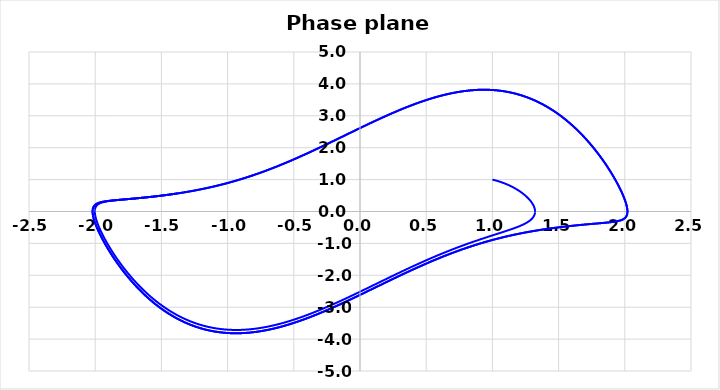
| Category | Limit cycle |
|---|---|
| 1.0 | 1 |
| 1.0197933949171882 | 0.979 |
| 1.03914770596447 | 0.956 |
| 1.0580254671649842 | 0.931 |
| 1.0763912294928906 | 0.905 |
| 1.0942118133788927 | 0.877 |
| 1.1114565302154946 | 0.847 |
| 1.1280973692363514 | 0.817 |
| 1.1441091470586815 | 0.784 |
| 1.1594696181584052 | 0.751 |
| 1.1741595455528482 | 0.717 |
| 1.188162731954155 | 0.683 |
| 1.2014660125894705 | 0.647 |
| 1.2140592117277966 | 0.612 |
| 1.2259350656811034 | 0.576 |
| 1.237089115639225 | 0.54 |
| 1.2475195741428324 | 0.503 |
| 1.2572271692927648 | 0.467 |
| 1.2662149709409305 | 0.431 |
| 1.2744882031178237 | 0.396 |
| 1.2820540468392958 | 0.361 |
| 1.2889214372189812 | 0.326 |
| 1.2951008585131094 | 0.292 |
| 1.3006041403624768 | 0.258 |
| 1.3054442580927605 | 0.226 |
| 1.3096351395083532 | 0.194 |
| 1.3131914801836095 | 0.162 |
| 1.316128568833362 | 0.132 |
| 1.3184621239435304 | 0.102 |
| 1.3202081424715622 | 0.073 |
| 1.3213827610915212 | 0.045 |
| 1.322002130163707 | 0.017 |
| 1.3220823003553783 | -0.009 |
| 1.3216391216273864 | -0.035 |
| 1.3206881541297772 | -0.06 |
| 1.319244590415135 | -0.084 |
| 1.3173231882783347 | -0.108 |
| 1.3149382134616945 | -0.131 |
| 1.3121033914213578 | -0.153 |
| 1.3088318673300967 | -0.174 |
| 1.3051361734898177 | -0.195 |
| 1.3010282033402603 | -0.216 |
| 1.2965191912754244 | -0.235 |
| 1.2916196975132255 | -0.255 |
| 1.2863395973041694 | -0.273 |
| 1.280688073809281 | -0.292 |
| 1.2746736140242465 | -0.31 |
| 1.2683040071742184 | -0.327 |
| 1.2615863450507687 | -0.344 |
| 1.2545270238080783 | -0.361 |
| 1.2471317467789065 | -0.378 |
| 1.239405527911639 | -0.395 |
| 1.231352695467413 | -0.411 |
| 1.2229768956507145 | -0.427 |
| 1.2142810958778205 | -0.443 |
| 1.2052675874149748 | -0.459 |
| 1.1959379871422773 | -0.474 |
| 1.1862932382199987 | -0.49 |
| 1.1763336094515449 | -0.506 |
| 1.166058693151709 | -0.522 |
| 1.155467401340336 | -0.538 |
| 1.1445579600902551 | -0.553 |
| 1.1333279018644729 | -0.57 |
| 1.1217740556813613 | -0.586 |
| 1.1098925349480797 | -0.602 |
| 1.097678722801935 | -0.619 |
| 1.0851272547969886 | -0.636 |
| 1.072231998769164 | -0.653 |
| 1.0589860317075803 | -0.671 |
| 1.0453816134531002 | -0.689 |
| 1.0314101570373488 | -0.708 |
| 1.0170621954670631 | -0.727 |
| 1.0023273447499095 | -0.747 |
| 0.9871942629492836 | -0.767 |
| 0.9716506050476192 | -0.788 |
| 0.955682973391012 | -0.809 |
| 0.9392768634833316 | -0.832 |
| 0.9224166048964424 | -0.855 |
| 0.9050852970659479 | -0.879 |
| 0.8872647397505754 | -0.904 |
| 0.8689353579498951 | -0.93 |
| 0.850076121101955 | -0.957 |
| 0.8306644564226574 | -0.985 |
| 0.8106761563060663 | -1.014 |
| 0.7900852797839921 | -1.045 |
| 0.7688640481499028 | -1.077 |
| 0.7469827349935411 | -1.111 |
| 0.7244095510772632 | -1.147 |
| 0.7011105247236266 | -1.184 |
| 0.6770493786889928 | -1.223 |
| 0.6521874048853725 | -1.264 |
| 0.6264833388009916 | -1.307 |
| 0.5998932360812081 | -1.352 |
| 0.5723703544914396 | -1.4 |
| 0.5438650454229336 | -1.451 |
| 0.5143246602551398 | -1.504 |
| 0.483693478293955 | -1.56 |
| 0.45191266470558544 | -1.619 |
| 0.41892026890561535 | -1.681 |
| 0.38465127628588347 | -1.746 |
| 0.34903772900672425 | -1.815 |
| 0.31200893487590914 | -1.888 |
| 0.2734917870830726 | -1.964 |
| 0.23341122172770623 | -2.044 |
| 0.19169084458126956 | -2.128 |
| 0.14825376318696587 | -2.216 |
| 0.10302366493284257 | -2.308 |
| 0.05592618568204451 | -2.403 |
| 0.006890616244180914 | -2.501 |
| -0.04414800550319837 | -2.603 |
| -0.09724637191999182 | -2.707 |
| -0.1524499152795164 | -2.813 |
| -0.20978932749063514 | -2.921 |
| -0.2692765912408031 | -3.028 |
| -0.3309005587048639 | -3.134 |
| -0.3946221615277199 | -3.237 |
| -0.4603693969000009 | -3.336 |
| -0.5280323081933325 | -3.429 |
| -0.5974582610765836 | -3.512 |
| -0.668447899903631 | -3.585 |
| -0.7407522427481584 | -3.643 |
| -0.8140714208534863 | -3.686 |
| -0.888055570682773 | -3.709 |
| -0.962308325517788 | -3.712 |
| -1.0363932147438133 | -3.692 |
| -1.10984305913079 | -3.649 |
| -1.1821721619331367 | -3.58 |
| -1.252890769456076 | -3.488 |
| -1.3215209586261691 | -3.372 |
| -1.387612859934962 | -3.234 |
| -1.4507599952718406 | -3.078 |
| -1.5106125370863044 | -2.905 |
| -1.5668874841337506 | -2.72 |
| -1.619375072550673 | -2.527 |
| -1.6679411442113492 | -2.329 |
| -1.7125256081486913 | -2.13 |
| -1.7531374891450704 | -1.932 |
| -1.7898473120959935 | -1.74 |
| -1.8227776991836733 | -1.555 |
| -1.852093063343099 | -1.379 |
| -1.8779891900481298 | -1.213 |
| -1.9006833446421512 | -1.058 |
| -1.9204053599243567 | -0.916 |
| -1.937389978344706 | -0.785 |
| -1.9518705655873914 | -0.665 |
| -1.964074188489359 | -0.557 |
| -1.9742179630011463 | -0.459 |
| -1.9825065244740998 | -0.371 |
| -1.9891304470386872 | -0.293 |
| -1.994265434201098 | -0.222 |
| -1.9980721122718956 | -0.16 |
| -2.0006962761185707 | -0.104 |
| -2.002269458585917 | -0.054 |
| -2.0029097176345876 | -0.01 |
| -2.002722556805349 | 0.028 |
| -2.001801913892307 | 0.063 |
| -2.000231169198946 | 0.094 |
| -1.9980841383707622 | 0.121 |
| -1.9954260257165173 | 0.145 |
| -1.9923143224500839 | 0.166 |
| -1.988799640763743 | 0.185 |
| -1.9849264794412287 | 0.202 |
| -1.9807339201678424 | 0.217 |
| -1.9762562560876076 | 0.23 |
| -1.9715235557401425 | 0.243 |
| -1.9665621664845614 | 0.253 |
| -1.9613951620457182 | 0.263 |
| -1.9560427390260262 | 0.272 |
| -1.9505225672112194 | 0.28 |
| -1.9448500983344017 | 0.287 |
| -1.9390388377042216 | 0.294 |
| -1.933100582789941 | 0.3 |
| -1.9270456325170353 | 0.306 |
| -1.9208829706816606 | 0.311 |
| -1.914620426554242 | 0.316 |
| -1.9082648154202373 | 0.32 |
| -1.9018220615049741 | 0.324 |
| -1.8952973054520654 | 0.328 |
| -1.888694998272275 | 0.332 |
| -1.882018983451633 | 0.336 |
| -1.875272568703177 | 0.339 |
| -1.8684585886644876 | 0.342 |
| -1.861579459681544 | 0.346 |
| -1.8546372276765668 | 0.349 |
| -1.8476336099716348 | 0.352 |
| -1.8405700318292457 | 0.355 |
| -1.8334476583739627 | 0.358 |
| -1.8262674224743405 | 0.36 |
| -1.819030049090045 | 0.363 |
| -1.8117360765242 | 0.366 |
| -1.8043858749643706 | 0.369 |
| -1.7969796626462062 | 0.372 |
| -1.7895175199307105 | 0.375 |
| -1.7819994015485778 | 0.377 |
| -1.7744251472323305 | 0.38 |
| -1.7667944909284898 | 0.383 |
| -1.7591070687571722 | 0.386 |
| -1.751362425864839 | 0.389 |
| -1.7435600222970373 | 0.392 |
| -1.7356992380014828 | 0.395 |
| -1.7277793770574366 | 0.397 |
| -1.7197996712147432 | 0.4 |
| -1.711759282814893 | 0.404 |
| -1.7036573071568242 | 0.407 |
| -1.6954927743617274 | 0.41 |
| -1.6872646507836884 | 0.413 |
| -1.67897184000646 | 0.416 |
| -1.6706131834608968 | 0.42 |
| -1.6621874606924778 | 0.423 |
| -1.653693389303825 | 0.426 |
| -1.6451296245930966 | 0.43 |
| -1.6364947589055345 | 0.434 |
| -1.627787320712218 | 0.437 |
| -1.6190057734271535 | 0.441 |
| -1.6101485139711837 | 0.445 |
| -1.601213871088773 | 0.449 |
| -1.5922001034214919 | 0.453 |
| -1.5831053973399427 | 0.457 |
| -1.5739278645339216 | 0.461 |
| -1.5646655393587565 | 0.465 |
| -1.555316375933993 | 0.47 |
| -1.5458782449888804 | 0.474 |
| -1.5363489304474323 | 0.479 |
| -1.5267261257441684 | 0.484 |
| -1.5170074298599856 | 0.488 |
| -1.507190343065918 | 0.493 |
| -1.4972722623608399 | 0.498 |
| -1.4872504765873955 | 0.504 |
| -1.4771221612086147 | 0.509 |
| -1.4668843727257668 | 0.515 |
| -1.4565340427160025 | 0.52 |
| -1.4460679714662172 | 0.526 |
| -1.435482821177331 | 0.532 |
| -1.4247751087107914 | 0.539 |
| -1.4139411978465612 | 0.545 |
| -1.4029772910191178 | 0.552 |
| -1.3918794204950697 | 0.558 |
| -1.3806434389528408 | 0.565 |
| -1.369265009421486 | 0.573 |
| -1.3577395945320418 | 0.58 |
| -1.3460624450308767 | 0.588 |
| -1.3342285875002389 | 0.596 |
| -1.3222328112266115 | 0.604 |
| -1.3100696541525056 | 0.612 |
| -1.2977333878419652 | 0.621 |
| -1.285218001384264 | 0.63 |
| -1.2725171841540222 | 0.64 |
| -1.2596243073392404 | 0.65 |
| -1.2465324041414882 | 0.66 |
| -1.233234148544689 | 0.67 |
| -1.2197218325405657 | 0.681 |
| -1.2059873416898481 | 0.692 |
| -1.19202212888876 | 0.704 |
| -1.1778171862001021 | 0.716 |
| -1.16336301459743 | 0.729 |
| -1.1486495914594048 | 0.742 |
| -1.133666335639403 | 0.756 |
| -1.1184020699229922 | 0.77 |
| -1.1028449806729799 | 0.785 |
| -1.0869825744485924 | 0.801 |
| -1.0708016313721187 | 0.817 |
| -1.0542881550033378 | 0.834 |
| -1.0374273184695983 | 0.852 |
| -1.0202034065880121 | 0.871 |
| -1.0025997537064846 | 0.89 |
| -0.9845986769830373 | 0.91 |
| -0.9661814048191243 | 0.932 |
| -0.9473280001637301 | 0.954 |
| -0.9280172784126406 | 0.977 |
| -0.9082267196435398 | 1.002 |
| -0.8879323749551791 | 1.028 |
| -0.8671087667211647 | 1.055 |
| -0.845728782630121 | 1.083 |
| -0.8237635634693461 | 1.113 |
| -0.8011823847250945 | 1.145 |
| -0.777952532227331 | 1.178 |
| -0.7540391722700931 | 1.213 |
| -0.7294052169026094 | 1.25 |
| -0.7040111854258131 | 1.289 |
| -0.6778150635617975 | 1.331 |
| -0.6507721623116299 | 1.374 |
| -0.6228349792055201 | 1.42 |
| -0.5939530655090575 | 1.469 |
| -0.5640729040155834 | 1.52 |
| -0.533137803368559 | 1.574 |
| -0.5010878164649085 | 1.631 |
| -0.4678596924409708 | 1.692 |
| -0.43338687408957355 | 1.756 |
| -0.39759955535181485 | 1.823 |
| -0.3604248168161501 | 1.895 |
| -0.32178686097141856 | 1.97 |
| -0.28160737330321295 | 2.049 |
| -0.23980604015255225 | 2.132 |
| -0.19630125945920418 | 2.219 |
| -0.15101108587116138 | 2.311 |
| -0.10385445684978276 | 2.406 |
| -0.05475275076746734 | 2.505 |
| -0.003631730747976611 | 2.608 |
| 0.04957607202205966 | 2.714 |
| 0.10492848611956938 | 2.822 |
| 0.1624703000566578 | 2.932 |
| 0.2222293151710773 | 3.044 |
| 0.28421186186790204 | 3.155 |
| 0.34839783362644605 | 3.264 |
| 0.4147353522983309 | 3.369 |
| 0.48313525305680494 | 3.47 |
| 0.5534656658468616 | 3.562 |
| 0.6255470666128538 | 3.644 |
| 0.6991482654926284 | 3.714 |
| 0.7739838748349923 | 3.767 |
| 0.8497138369062666 | 3.803 |
| 0.9259455667497861 | 3.817 |
| 1.0022391592381419 | 3.808 |
| 1.0781159088118955 | 3.775 |
| 1.1530700992007241 | 3.716 |
| 1.2265836631183333 | 3.631 |
| 1.2981429352613973 | 3.521 |
| 1.3672563893287633 | 3.387 |
| 1.4334720286366207 | 3.231 |
| 1.4963930445106206 | 3.058 |
| 1.5556904916189587 | 2.87 |
| 1.611112040122334 | 2.671 |
| 1.6624862985529307 | 2.466 |
| 1.709722681428863 | 2.258 |
| 1.7528072395835816 | 2.051 |
| 1.7917952119875322 | 1.849 |
| 1.8268012571708958 | 1.653 |
| 1.8579883745684895 | 1.467 |
| 1.88555645292661 | 1.292 |
| 1.9097312226150343 | 1.128 |
| 1.930754184173776 | 0.976 |
| 1.9488738746840626 | 0.838 |
| 1.964338644216772 | 0.711 |
| 1.9773909625014858 | 0.596 |
| 1.9882631665144184 | 0.493 |
| 1.9971744908291649 | 0.4 |
| 2.0043291878414315 | 0.317 |
| 2.0099155361339425 | 0.243 |
| 2.0141055441309086 | 0.177 |
| 2.017055175771425 | 0.119 |
| 2.018904949738615 | 0.067 |
| 2.0197807899302376 | 0.021 |
| 2.0197950298388267 | -0.019 |
| 2.019047495899386 | -0.055 |
| 2.0176266140160255 | -0.087 |
| 2.0156104992718546 | -0.115 |
| 2.0130680014506366 | -0.139 |
| 2.0100596888124453 | -0.161 |
| 2.0066387599932 | -0.181 |
| 2.002851879366871 | -0.198 |
| 1.998739935114129 | -0.213 |
| 1.99433872192715 | -0.227 |
| 1.9896795520369237 | -0.239 |
| 1.9847897993128756 | -0.25 |
| 1.9796933817427211 | -0.26 |
| 1.974411187799498 | -0.268 |
| 1.9689614521544943 | -0.276 |
| 1.9633600859832514 | -0.284 |
| 1.957620966798903 | -0.29 |
| 1.9517561923775673 | -0.296 |
| 1.945776302946057 | -0.302 |
| 1.939690475404605 | -0.307 |
| 1.9335066929711198 | -0.312 |
| 1.9272318932678405 | -0.316 |
| 1.9208720975314126 | -0.32 |
| 1.9144325233159578 | -0.324 |
| 1.9079176827763433 | -0.328 |
| 1.9013314683650335 | -0.331 |
| 1.8946772275492882 | -0.334 |
| 1.8879578279542488 | -0.338 |
| 1.881175714159571 | -0.341 |
| 1.8743329572205827 | -0.344 |
| 1.8674312978473495 | -0.347 |
| 1.8604721840544898 | -0.349 |
| 1.8534568039891754 | -0.352 |
| 1.8463861145527516 | -0.355 |
| 1.8392608663511834 | -0.358 |
| 1.8320816254396717 | -0.36 |
| 1.8248487922659722 | -0.363 |
| 1.8175626181640547 | -0.366 |
| 1.8102232197037582 | -0.368 |
| 1.8028305911621179 | -0.371 |
| 1.7953846153472919 | -0.374 |
| 1.7878850729758191 | -0.376 |
| 1.780331650777678 | -0.379 |
| 1.7727239484807877 | -0.382 |
| 1.765061484806731 | -0.385 |
| 1.7573437025921919 | -0.387 |
| 1.7495699731355487 | -0.39 |
| 1.7417395998549396 | -0.393 |
| 1.7338518213326783 | -0.396 |
| 1.725905813810902 | -0.399 |
| 1.7179006931945984 | -0.402 |
| 1.709835516610511 | -0.405 |
| 1.7017092835637162 | -0.408 |
| 1.6935209367277706 | -0.411 |
| 1.6852693623991442 | -0.414 |
| 1.676953390642071 | -0.417 |
| 1.6685717951458945 | -0.421 |
| 1.6601232928133811 | -0.424 |
| 1.6516065430952627 | -0.428 |
| 1.6430201470833823 | -0.431 |
| 1.6343626463722236 | -0.435 |
| 1.6256325216962464 | -0.438 |
| 1.6168281913482996 | -0.442 |
| 1.6079480093824048 | -0.446 |
| 1.5989902636023627 | -0.45 |
| 1.5899531733359134 | -0.454 |
| 1.5808348869925506 | -0.458 |
| 1.5716334794015325 | -0.462 |
| 1.5623469489251176 | -0.466 |
| 1.5529732143405879 | -0.471 |
| 1.5435101114831555 | -0.475 |
| 1.5339553896403995 | -0.48 |
| 1.524306707687406 | -0.485 |
| 1.5145616299502913 | -0.49 |
| 1.504717621784248 | -0.495 |
| 1.4947720448506612 | -0.5 |
| 1.4847221520761857 | -0.505 |
| 1.4745650822749263 | -0.511 |
| 1.464297854413031 | -0.516 |
| 1.4539173614930563 | -0.522 |
| 1.4434203640333911 | -0.528 |
| 1.4328034831158156 | -0.534 |
| 1.4220631929718988 | -0.54 |
| 1.4111958130764017 | -0.547 |
| 1.4001974997131164 | -0.553 |
| 1.3890642369756296 | -0.56 |
| 1.3777918271623284 | -0.567 |
| 1.3663758805215376 | -0.574 |
| 1.3548118042989825 | -0.582 |
| 1.3430947910357751 | -0.59 |
| 1.3312198060607965 | -0.598 |
| 1.3191815741166844 | -0.606 |
| 1.3069745650535836 | -0.615 |
| 1.2945929785193637 | -0.624 |
| 1.2820307275691167 | -0.633 |
| 1.2692814211103933 | -0.642 |
| 1.2563383450937786 | -0.652 |
| 1.2431944423510328 | -0.662 |
| 1.229842290975086 | -0.673 |
| 1.2162740811276598 | -0.684 |
| 1.2024815901511816 | -0.695 |
| 1.1884561558519187 | -0.707 |
| 1.1741886478109105 | -0.72 |
| 1.1596694365683091 | -0.732 |
| 1.144888360515171 | -0.746 |
| 1.1298346903146275 | -0.76 |
| 1.1144970906617657 | -0.774 |
| 1.0988635791785795 | -0.789 |
| 1.0829214822271587 | -0.805 |
| 1.0666573874110956 | -0.821 |
| 1.0500570925221697 | -0.839 |
| 1.0331055506771474 | -0.857 |
| 1.0157868113784785 | -0.875 |
| 0.9980839572234768 | -0.895 |
| 0.9799790359800907 | -0.916 |
| 0.9614529877447026 | -0.937 |
| 0.9424855668999582 | -0.96 |
| 0.9230552586002075 | -0.983 |
| 0.9031391895309895 | -1.008 |
| 0.8827130327199685 | -1.034 |
| 0.8617509062233849 | -1.062 |
| 0.8402252655788708 | -1.091 |
| 0.8181067900079413 | -1.121 |
| 0.7953642624764659 | -1.153 |
| 0.7719644438874262 | -1.187 |
| 0.747871941897704 | -1.223 |
| 0.7230490751322636 | -1.26 |
| 0.6974557339304316 | -1.3 |
| 0.6710492392188164 | -1.341 |
| 0.6437842016863291 | -1.386 |
| 0.6156123841656406 | -1.432 |
| 0.5864825710339283 | -1.481 |
| 0.5563404495707568 | -1.533 |
| 0.5251285095945366 | -1.588 |
| 0.49278596938830194 | -1.646 |
| 0.45924873797159077 | -1.708 |
| 0.42444942623090626 | -1.773 |
| 0.38831742233757516 | -1.841 |
| 0.3507790503017961 | -1.913 |
| 0.311757834460823 | -1.989 |
| 0.2711748971716822 | -2.07 |
| 0.2289495219173599 | -2.154 |
| 0.18499991930401535 | -2.242 |
| 0.13924423877424846 | -2.334 |
| 0.09160187387495433 | -2.431 |
| 0.04199511296746764 | -2.531 |
| -0.00964881055800778 | -2.634 |
| -0.06339521545517078 | -2.741 |
| -0.11929896979745075 | -2.85 |
| -0.17740095331166492 | -2.961 |
| -0.23772397175967386 | -3.072 |
| -0.3002681437275775 | -3.182 |
| -0.3650058277181154 | -3.291 |
| -0.4318762205790669 | -3.395 |
| -0.5007798369149808 | -3.494 |
| -0.5715731703435887 | -3.584 |
| -0.644063934444393 | -3.663 |
| -0.7180073722327737 | -3.729 |
| -0.793104190945973 | -3.778 |
| -0.869000702537314 | -3.808 |
| -0.9452917068228256 | -3.817 |
| -1.0215265245960412 | -3.802 |
| -1.0972183634153208 | -3.763 |
| -1.1718568875871145 | -3.697 |
| -1.2449234964177973 | -3.605 |
| -1.3159084428763834 | -3.489 |
| -1.3843286142676194 | -3.349 |
| -1.4497446131581326 | -3.189 |
| -1.5117757687809106 | -3.011 |
| -1.5701118916624148 | -2.82 |
| -1.6245209324269647 | -2.619 |
| -1.6748521593247234 | -2.413 |
| -1.7210349474705944 | -2.205 |
| -1.763073695986142 | -1.999 |
| -1.8010396965083773 | -1.798 |
| -1.8350609378821012 | -1.605 |
| -1.865310849365955 | -1.422 |
| -1.8919968854204627 | -1.249 |
| -1.9153496796406415 | -1.088 |
| -1.93561328605538 | -0.94 |
| -1.9530368185516445 | -0.804 |
| -1.9678676182310595 | -0.681 |
| -1.9803459370444332 | -0.569 |
| -1.9907010273124468 | -0.468 |
| -1.999148467254813 | -0.378 |
| -2.005888525279494 | -0.297 |
| -2.011105362171793 | -0.226 |
| -2.0149668825247287 | -0.162 |
| -2.0176250681102865 | -0.105 |
| -2.01921665134762 | -0.055 |
| -2.0198640130671 | -0.011 |
| -2.0196762131938635 | 0.029 |
| -2.018750084580788 | 0.063 |
| -2.0171713385189127 | 0.094 |
| -2.0150156454164767 | 0.121 |
| -2.0123496660118665 | 0.145 |
| -2.009232017653745 | 0.166 |
| -2.005714167073316 | 0.185 |
| -2.0018412461107 | 0.202 |
| -1.9976527904229637 | 0.217 |
| -1.9931834036265346 | 0.23 |
| -1.9884633508873693 | 0.242 |
| -1.983519086891613 | 0.252 |
| -1.9783737235842258 | 0.262 |
| -1.9730474431900293 | 0.271 |
| -1.967557861935025 | 0.278 |
| -1.9619203496434863 | 0.285 |
| -1.9561483100553938 | 0.292 |
| -1.9502534263303561 | 0.298 |
| -1.9442458758071774 | 0.303 |
| -1.9381345176924119 | 0.308 |
| -1.931927056969572 | 0.313 |
| -1.9256301874611705 | 0.317 |
| -1.919249716642965 | 0.321 |
| -1.9127906745056809 | 0.325 |
| -1.9062574084844481 | 0.328 |
| -1.8996536662294006 | 0.332 |
| -1.8929826677708894 | 0.335 |
| -1.8862471684376538 | 0.338 |
| -1.8794495137139808 | 0.341 |
| -1.8725916870702441 | 0.344 |
| -1.8656753516681224 | 0.347 |
| -1.858701886725265 | 0.35 |
| -1.851672419222329 | 0.353 |
| -1.8445878515464322 | 0.356 |
| -1.837448885587599 | 0.358 |
| -1.8302560437373236 | 0.361 |
| -1.82300968717967 | 0.364 |
| -1.815710031814278 | 0.366 |
| -1.808357162106265 | 0.369 |
| -1.800951043119422 | 0.372 |
| -1.7934915309555792 | 0.374 |
| -1.7859783817938633 | 0.377 |
| -1.7784112596982256 | 0.38 |
| -1.7707897433395845 | 0.382 |
| -1.7631133317597527 | 0.385 |
| -1.755381449287626 | 0.388 |
| -1.7475934497035777 | 0.391 |
| -1.7397486197353276 | 0.394 |
| -1.7318461819575013 | 0.397 |
| -1.723885297157433 | 0.4 |
| -1.715865066221328 | 0.403 |
| -1.7077845315874969 | 0.406 |
| -1.6996426783068916 | 0.409 |
| -1.6914384347454638 | 0.412 |
| -1.6831706729578457 | 0.415 |
| -1.6748382087574105 | 0.418 |
| -1.666439801503838 | 0.422 |
| -1.6579741536258086 | 0.425 |
| -1.6494399098933252 | 0.428 |
| -1.640835656451356 | 0.432 |
| -1.6321599196239593 | 0.436 |
| -1.6234111644957496 | 0.439 |
| -1.6145877932754602 | 0.443 |
| -1.6056881434444168 | 0.447 |
| -1.5967104856909273 | 0.451 |
| -1.5876530216299003 | 0.455 |
| -1.578513881305389 | 0.459 |
| -1.5692911204722164 | 0.463 |
| -1.5599827176513388 | 0.468 |
| -1.5505865709521323 | 0.472 |
| -1.5411004946533382 | 0.477 |
| -1.5315222155329375 | 0.481 |
| -1.521849368935755 | 0.486 |
| -1.5120794945660876 | 0.491 |
| -1.5022100319910963 | 0.496 |
| -1.4922383158391022 | 0.501 |
| -1.4821615706752356 | 0.507 |
| -1.4719769055351335 | 0.512 |
| -1.4616813080955062 | 0.518 |
| -1.4512716384584248 | 0.523 |
| -1.4407446225240659 | 0.529 |
| -1.4300968449244098 | 0.535 |
| -1.4193247414879657 | 0.542 |
| -1.408424591203021 | 0.548 |
| -1.397392507644119 | 0.555 |
| -1.3862244298234725 | 0.562 |
| -1.3749161124257916 | 0.569 |
| -1.3634631153815022 | 0.576 |
| -1.3518607927295705 | 0.584 |
| -1.340104280717064 | 0.592 |
| -1.3281884850781818 | 0.6 |
| -1.3161080674307144 | 0.608 |
| -1.3038574307227553 | 0.617 |
| -1.2914307036569168 | 0.626 |
| -1.278821724013302 | 0.635 |
| -1.2660240207860014 | 0.645 |
| -1.2530307950409032 | 0.655 |
| -1.2398348993950818 | 0.665 |
| -1.2264288160099586 | 0.676 |
| -1.2128046329817581 | 0.687 |
| -1.1989540190035202 | 0.698 |
| -1.1848681961630323 | 0.71 |
| -1.1705379107305456 | 0.723 |
| -1.1559534017790087 | 0.736 |
| -1.141104367467848 | 0.749 |
| -1.125979928809074 | 0.763 |
| -1.110568590721793 | 0.778 |
| -1.09485820016816 | 0.793 |
| -1.0788359011505886 | 0.809 |
| -1.0624880863368917 | 0.826 |
| -1.0458003450672357 | 0.843 |
| -1.0287574074848114 | 0.861 |
| -1.0113430845214717 | 0.88 |
| -0.9935402034609876 | 0.9 |
| -0.9753305387969411 | 0.921 |
| -0.9566947381007869 | 0.943 |
| -0.9376122426197634 | 0.966 |
| -0.91806120233603 | 0.99 |
| -0.898018385240028 | 1.015 |
| -0.877459080605643 | 1.041 |
| -0.8563569961060324 | 1.069 |
| -0.8346841486817 | 1.098 |
| -0.8124107491723851 | 1.129 |
| -0.7895050808588349 | 1.162 |
| -0.7659333722384811 | 1.196 |
| -0.7416596645914156 | 1.232 |
| -0.7166456751932695 | 1.27 |
| -0.6908506574159562 | 1.31 |
| -0.6642312594454283 | 1.352 |
| -0.6367413839612415 | 1.397 |
| -0.6083320518938727 | 1.444 |
| -0.5789512743353524 | 1.494 |
| -0.5485439378650334 | 1.547 |
| -0.5170517100086607 | 1.603 |
| -0.48441297332355066 | 1.662 |
| -0.45056279874741517 | 1.724 |
| -0.4154329714160181 | 1.79 |
| -0.3789520851950988 | 1.859 |
| -0.3410457257244559 | 1.932 |
| -0.3016367658558737 | 2.009 |
| -0.260645801964979 | 2.09 |
| -0.2179917646558996 | 2.176 |
| -0.17359274269542155 | 2.265 |
| -0.12736706432286432 | 2.358 |
| -0.07923468492084944 | 2.456 |
| -0.02911893370532409 | 2.557 |
| 0.023051326390971467 | 2.661 |
| 0.07733907345706804 | 2.768 |
| 0.13379599102067458 | 2.878 |
| 0.19245879183075165 | 2.989 |
| 0.25334499515881664 | 3.1 |
| 0.31644818860059437 | 3.21 |
| 0.3817328567480137 | 3.318 |
| 0.44912892625616546 | 3.421 |
| 0.5185262590409375 | 3.518 |
| 0.5897694188447214 | 3.605 |
| 0.6626531331977649 | 3.681 |
| 0.7369189597674144 | 3.743 |
| 0.8122537249529633 | 3.788 |
| 0.8882903113277163 | 3.813 |
| 0.9646113067898924 | 3.816 |
| 1.040755874879009 | 3.795 |
| 1.1162299575830366 | 3.748 |
| 1.1905195927687853 | 3.676 |
| 1.2631067541463323 | 3.578 |
| 1.3334867587750932 | 3.456 |
| 1.401186002937013 | 3.311 |
| 1.4657786447556433 | 3.146 |
| 1.5269008922558565 | 2.964 |
| 1.5842617839377375 | 2.77 |
| 1.6376497306495896 | 2.568 |
| 1.6869345553893877 | 2.36 |
| 1.7320652392123015 | 2.153 |
| 1.7730639799270327 | 1.948 |
| 1.810017442117304 | 1.749 |
| 1.843066200614834 | 1.558 |
| 1.8723933642035135 | 1.377 |
| 1.898213243685148 | 1.207 |
| 1.920760740507145 | 1.05 |
| 1.9402819203062969 | 0.905 |
| 1.9570260331157394 | 0.772 |
| 1.97123907023107 | 0.651 |
| 1.9831588170980556 | 0.542 |
| 1.993011273304029 | 0.445 |
| 2.001008260156446 | 0.357 |
| 2.007346015770318 | 0.278 |
| 2.0122045786870633 | 0.209 |
| 2.0157477761344227 | 0.147 |
| 2.0181236558467828 | 0.092 |
| 2.0194652262454724 | 0.043 |
| 2.019891395575279 | 0 |
| 2.019508024385421 | -0.038 |
| 2.0184090265363333 | -0.071 |
| 2.0166774713565605 | -0.101 |
| 2.014386653724734 | -0.127 |
| 2.011601110001506 | -0.151 |
| 2.0083775662871135 | -0.171 |
| 2.0047658118637925 | -0.19 |
| 2.0008094953125513 | -0.206 |
| 1.9965468440416345 | -0.22 |
| 1.9920113101464556 | -0.233 |
| 1.9872321468999474 | -0.245 |
| 1.9822349209590575 | -0.255 |
| 1.9770419657333524 | -0.264 |
| 1.9716727814233923 | -0.273 |
| 1.9661443870965838 | -0.28 |
| 1.9604716298987623 | -0.287 |
| 1.9546674561534507 | -0.293 |
| 1.9487431487152977 | -0.299 |
| 1.9427085345459476 | -0.304 |
| 1.9365721660873492 | -0.309 |
| 1.9303414796308573 | -0.314 |
| 1.9240229335274317 | -0.318 |
| 1.9176221287585802 | -0.322 |
| 1.9111439140909816 | -0.326 |
| 1.904592477769932 | -0.329 |
| 1.8979714274669224 | -0.333 |
| 1.8912838599831436 | -0.336 |
| 1.884532422021574 | -0.339 |
| 1.8777193631734357 | -0.342 |
| 1.8708465821180462 | -0.345 |
| 1.8639156669063859 | -0.348 |
| 1.8569279300860515 | -0.351 |
| 1.849884439326863 | -0.354 |
| 1.8427860441205395 | -0.356 |
| 1.8356333990530562 | -0.359 |
| 1.8284269840831637 | -0.362 |
| 1.8211671222038883 | -0.364 |
| 1.813853994814554 | -0.367 |
| 1.8064876550880313 | -0.37 |
| 1.7990680395806797 | -0.372 |
| 1.7915949783000853 | -0.375 |
| 1.784068203417566 | -0.378 |
| 1.7764873567879509 | -0.38 |
| 1.7688519964178713 | -0.383 |
| 1.7611616020052825 | -0.386 |
| 1.7534155796568318 | -0.389 |
| 1.7456132658756347 | -0.392 |
| 1.737753930899792 | -0.394 |
| 1.7298367814612905 | -0.397 |
| 1.7218609630256003 | -0.4 |
| 1.7138255615641147 | -0.403 |
| 1.705729604904425 | -0.406 |
| 1.6975720636971452 | -0.409 |
| 1.689351852032476 | -0.413 |
| 1.681067827734832 | -0.416 |
| 1.67271879235955 | -0.419 |
| 1.6643034909118748 | -0.422 |
| 1.6558206113050302 | -0.426 |
| 1.6472687835711266 | -0.429 |
| 1.638646578835941 | -0.433 |
| 1.629952508066122 | -0.437 |
| 1.6211850205951333 | -0.44 |
| 1.6123425024321831 | -0.444 |
| 1.603423274356485 | -0.448 |
| 1.5944255897974173 | -0.452 |
| 1.5853476324994784 | -0.456 |
| 1.576187513969337 | -0.46 |
| 1.5669432707007531 | -0.464 |
| 1.5576128611716487 | -0.469 |
| 1.5481941626061488 | -0.473 |
| 1.5386849674929555 | -0.478 |
| 1.5290829798499572 | -0.482 |
| 1.5193858112234966 | -0.487 |
| 1.5095909764091997 | -0.492 |
| 1.499695888879712 | -0.497 |
| 1.4896978559030551 | -0.503 |
| 1.4795940733336235 | -0.508 |
| 1.4693816200560474 | -0.513 |
| 1.4590574520602595 | -0.519 |
| 1.4486183961240906 | -0.525 |
| 1.438061143077582 | -0.531 |
| 1.4273822406209091 | -0.537 |
| 1.4165780856653596 | -0.543 |
| 1.4056449161641715 | -0.55 |
| 1.394578802397201 | -0.557 |
| 1.3833756376703321 | -0.564 |
| 1.3720311283872448 | -0.571 |
| 1.3605407834475953 | -0.578 |
| 1.3488999029218174 | -0.586 |
| 1.3371035659485964 | -0.594 |
| 1.325146617796574 | -0.602 |
| 1.3130236560269828 | -0.61 |
| 1.3007290156886606 | -0.619 |
| 1.288256753471225 | -0.628 |
| 1.2756006307360626 | -0.638 |
| 1.2627540953381835 | -0.647 |
| 1.2497102621448792 | -0.657 |
| 1.2364618921494581 | -0.668 |
| 1.2230013700701134 | -0.678 |
| 1.2093206803151642 | -0.69 |
| 1.195411381186477 | -0.701 |
| 1.1812645771828418 | -0.713 |
| 1.1668708892543982 | -0.726 |
| 1.152220422847942 | -0.739 |
| 1.137302733571087 | -0.753 |
| 1.1221067902908868 | -0.767 |
| 1.1066209354697205 | -0.782 |
| 1.0908328425281402 | -0.797 |
| 1.0747294700111538 | -0.813 |
| 1.05829701232133 | -0.83 |
| 1.04152084676948 | -0.848 |
| 1.0243854766819742 | -0.866 |
| 1.006874470293538 | -0.885 |
| 0.9889703951464347 | -0.905 |
| 0.97065474771223 | -0.926 |
| 0.9519078779521196 | -0.948 |
| 0.9327089085376652 | -0.972 |
| 0.9130356484677397 | -0.996 |
| 0.8928645008420742 | -1.021 |
| 0.8721703645902171 | -1.048 |
| 0.850926530010939 | -1.076 |
| 0.8291045680561366 | -1.106 |
| 0.8066742134012619 | -1.137 |
| 0.7836032414888837 | -1.17 |
| 0.759857339922591 | -1.205 |
| 0.7353999748366147 | -1.241 |
| 0.7101922531863887 | -1.28 |
| 0.6841927823138978 | -1.32 |
| 0.6573575286597129 | -1.363 |
| 0.6296396781457793 | -1.409 |
| 0.6009895015685605 | -1.457 |
| 0.5713542293552999 | -1.507 |
| 0.5406779412864788 | -1.561 |
| 0.5089014783197263 | -1.617 |
| 0.47596238551376124 | -1.677 |
| 0.4417948972977604 | -1.74 |
| 0.40632997901437445 | -1.807 |
| 0.36949544183135735 | -1.877 |
| 0.3312161518030156 | -1.951 |
| 0.29141435808014937 | -2.029 |
| 0.2500101699869012 | -2.112 |
| 0.2069222178118178 | -2.198 |
| 0.16206853750930061 | -2.288 |
| 0.11536772474986613 | -2.383 |
| 0.06674040837783522 | -2.481 |
| 0.01611109656905598 | -2.583 |
| -0.03658955024751672 | -2.688 |
| -0.09142196877823835 | -2.796 |
| -0.1484344225317823 | -2.906 |
| -0.2076591866141132 | -3.017 |
| -0.2691081898608816 | -3.128 |
| -0.3327681568484436 | -3.238 |
| -0.3985953476473008 | -3.344 |
| -0.46651006431418873 | -3.446 |
| -0.536391178691569 | -3.541 |
| -0.6080710313647049 | -3.626 |
| -0.6813311473812552 | -3.698 |
| -0.7558992961044906 | -3.756 |
| -0.8314484709214022 | -3.796 |
| -0.9075983569441703 | -3.816 |
| -0.9839197696791508 | -3.813 |
| -1.0599423700969148 | -3.785 |
| -1.1351656907408905 | -3.733 |
| -1.209073162624909 | -3.654 |
| -1.2811484553341226 | -3.55 |
| -1.3508930932656116 | -3.421 |
| -1.4178440572526383 | -3.271 |
| -1.481589981980852 | -3.101 |
| -1.5417846486169433 | -2.916 |
| -1.598156744044548 | -2.72 |
| -1.6505152689192193 | -2.515 |
| -1.6987504534611866 | -2.308 |
| -1.742830499552729 | -2.101 |
| -1.7827948380330132 | -1.897 |
| -1.8187448251411795 | -1.699 |
| -1.850832888529318 | -1.511 |
| -1.8792510871492811 | -1.333 |
| -1.9042199060294747 | -1.166 |
| -1.9259779092916036 | -1.012 |
| -1.9447726625453887 | -0.87 |
| -1.9608531394322402 | -0.74 |
| -1.9744636651820184 | -0.623 |
| -1.9858393303048059 | -0.517 |
| -1.9952027294020531 | -0.421 |
| -2.0027618378690946 | -0.336 |
| -2.0087088249646863 | -0.26 |
| -2.0132196070414445 | -0.192 |
| -2.016453962301568 | -0.132 |
| -2.0185560524060406 | -0.079 |
| -2.0196552223688595 | -0.032 |
| -2.0198669755968286 | 0.01 |
| -2.0192940440324465 | 0.047 |
| -2.018027493316053 | 0.079 |
| -2.0161478194757425 | 0.108 |
| -2.0137260070110785 | 0.134 |
| -2.0108245286884157 | 0.156 |
| -2.0074982753271664 | 0.176 |
| -2.0037954097584083 | 0.194 |
| -1.9997581433845801 | 0.21 |
| -1.9954234367194148 | 0.224 |
| -1.9908236272437245 | 0.236 |
| -1.9859869891238537 | 0.247 |
| -1.9809382300043692 | 0.257 |
| -1.9756989303604764 | 0.266 |
| -1.9702879308982295 | 0.275 |
| -1.9647216733119086 | 0.282 |
| -1.9590144994147058 | 0.289 |
| -1.9531789132996011 | 0.295 |
| -1.9472258107965101 | 0.3 |
| -1.9411646800933973 | 0.306 |
| -1.9350037769991184 | 0.31 |
| -1.928750277954558 | 0.315 |
| -1.922410413552256 | 0.319 |
| -1.9159895850063158 | 0.323 |
| -1.9094924657250385 | 0.327 |
| -1.9029230898781375 | 0.33 |
| -1.8962849296173836 | 0.334 |
| -1.8895809624023812 | 0.337 |
| -1.8828137296998784 | 0.34 |
| -1.875985388163429 | 0.343 |
| -1.8690977542582339 | 0.346 |
| -1.8621523431715254 | 0.349 |
| -1.855150402739981 | 0.351 |
| -1.8480929430305795 | 0.354 |
| -1.8409807621283962 | 0.357 |
| -1.8338144686125974 | 0.36 |
| -1.82659450113902 | 0.362 |
| -1.8193211454930238 | 0.365 |
| -1.8119945494287397 | 0.368 |
| -1.8046147355694973 | 0.37 |
| -1.7971816126082698 | 0.373 |
| -1.7896949850157455 | 0.376 |
| -1.782154561436476 | 0.378 |
| -1.7745599619299406 | 0.381 |
| -1.7669107241928341 | 0.384 |
| -1.759206308881007 | 0.387 |
| -1.75144610413393 | 0.389 |
| -1.7436294293909926 | 0.392 |
| -1.7357555385771217 | 0.395 |
| -1.7278236227248838 | 0.398 |
| -1.7198328120912103 | 0.401 |
| -1.7117821778189939 | 0.404 |
| -1.7036707331868803 | 0.407 |
| -1.6954974344845046 | 0.41 |
| -1.6872611815450727 | 0.413 |
| -1.6789608179624709 | 0.417 |
| -1.670595131015913 | 0.42 |
| -1.6621628513214244 | 0.423 |
| -1.653662652226165 | 0.427 |
| -1.6450931489586322 | 0.43 |
| -1.636452897545122 | 0.434 |
| -1.62774039350042 | 0.437 |
| -1.6189540702984921 | 0.441 |
| -1.6100922976269307 | 0.445 |
| -1.601153379427039 | 0.449 |
| -1.5921355517196887 | 0.453 |
| -1.5830369802154385 | 0.457 |
| -1.5738557577058208 | 0.461 |
| -1.5645899012311906 | 0.465 |
| -1.5552373490190445 | 0.47 |
| -1.5457959571852622 | 0.474 |
| -1.5362634961892625 | 0.479 |
| -1.5266376470326068 | 0.484 |
| -1.5169159971890902 | 0.489 |
| -1.5070960362528352 | 0.493 |
| -1.4971751512893263 | 0.499 |
| -1.4871506218726784 | 0.504 |
| -1.4770196147907133 | 0.509 |
| -1.4667791783976014 | 0.515 |
| -1.456426236591912 | 0.521 |
| -1.4459575823958657 | 0.526 |
| -1.4353698711094123 | 0.532 |
| -1.4246596130104254 | 0.539 |
| -1.413823165569807 | 0.545 |
| -1.4028567251476067 | 0.552 |
| -1.391756318133378 | 0.558 |
| -1.3805177914908693 | 0.565 |